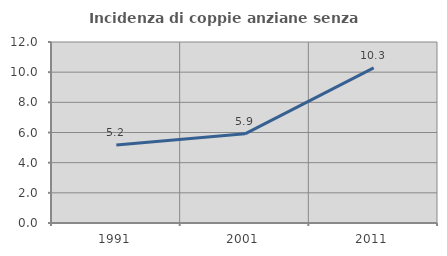
| Category | Incidenza di coppie anziane senza figli  |
|---|---|
| 1991.0 | 5.171 |
| 2001.0 | 5.91 |
| 2011.0 | 10.287 |